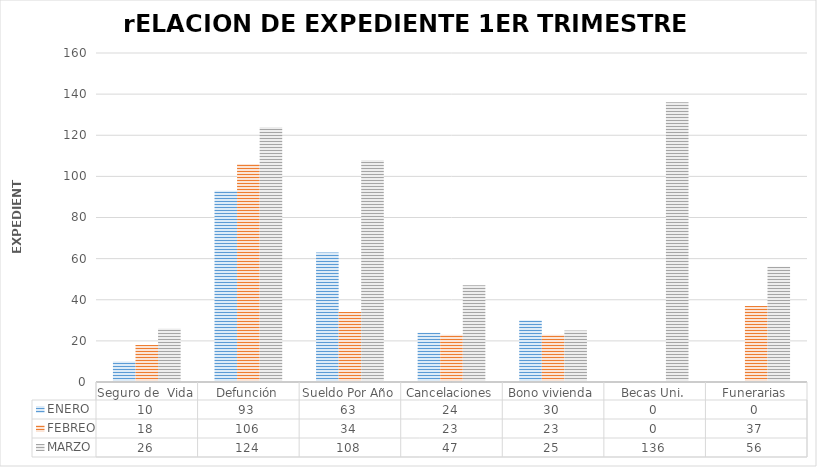
| Category | ENERO | FEBREO | MARZO |
|---|---|---|---|
| Seguro de  Vida | 10 | 18 | 26 |
| Defunción | 93 | 106 | 124 |
| Sueldo Por Año | 63 | 34 | 108 |
| Cancelaciones | 24 | 23 | 47 |
| Bono vivienda | 30 | 23 | 25 |
| Becas Uni. | 0 | 0 | 136 |
| Funerarias | 0 | 37 | 56 |